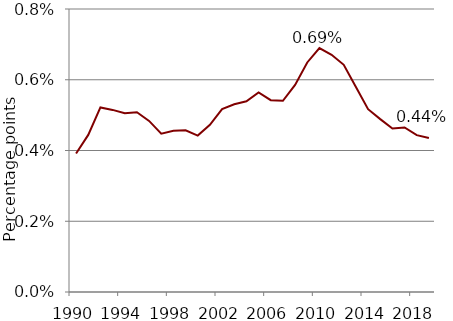
| Category | Series 0 |
|---|---|
| 1990.0 | 0.004 |
| 1991.0 | 0.004 |
| 1992.0 | 0.005 |
| 1993.0 | 0.005 |
| 1994.0 | 0.005 |
| 1995.0 | 0.005 |
| 1996.0 | 0.005 |
| 1997.0 | 0.004 |
| 1998.0 | 0.005 |
| 1999.0 | 0.005 |
| 2000.0 | 0.004 |
| 2001.0 | 0.005 |
| 2002.0 | 0.005 |
| 2003.0 | 0.005 |
| 2004.0 | 0.005 |
| 2005.0 | 0.006 |
| 2006.0 | 0.005 |
| 2007.0 | 0.005 |
| 2008.0 | 0.006 |
| 2009.0 | 0.006 |
| 2010.0 | 0.007 |
| 2011.0 | 0.007 |
| 2012.0 | 0.006 |
| 2013.0 | 0.006 |
| 2014.0 | 0.005 |
| 2015.0 | 0.005 |
| 2016.0 | 0.005 |
| 2017.0 | 0.005 |
| 2018.0 | 0.004 |
| 2019.0 | 0.004 |